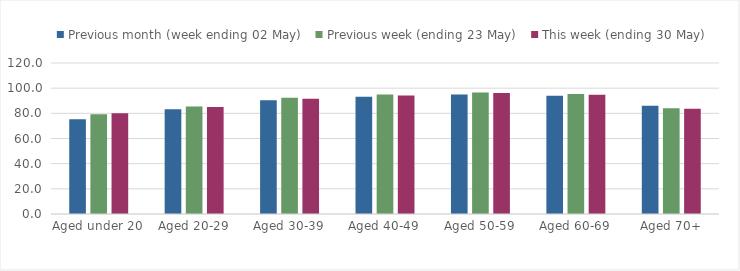
| Category | Previous month (week ending 02 May) | Previous week (ending 23 May) | This week (ending 30 May) |
|---|---|---|---|
| Aged under 20 | 75.303 | 79.297 | 80.114 |
| Aged 20-29 | 83.321 | 85.408 | 84.968 |
| Aged 30-39 | 90.462 | 92.362 | 91.621 |
| Aged 40-49 | 93.154 | 94.966 | 94.216 |
| Aged 50-59 | 94.894 | 96.645 | 96.162 |
| Aged 60-69 | 93.876 | 95.295 | 94.719 |
| Aged 70+ | 86.041 | 84.09 | 83.711 |